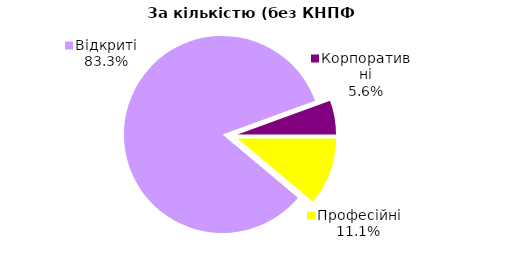
| Category | Series 0 |
|---|---|
| Відкриті | 45 |
| Корпоративні | 3 |
| Професійні | 6 |